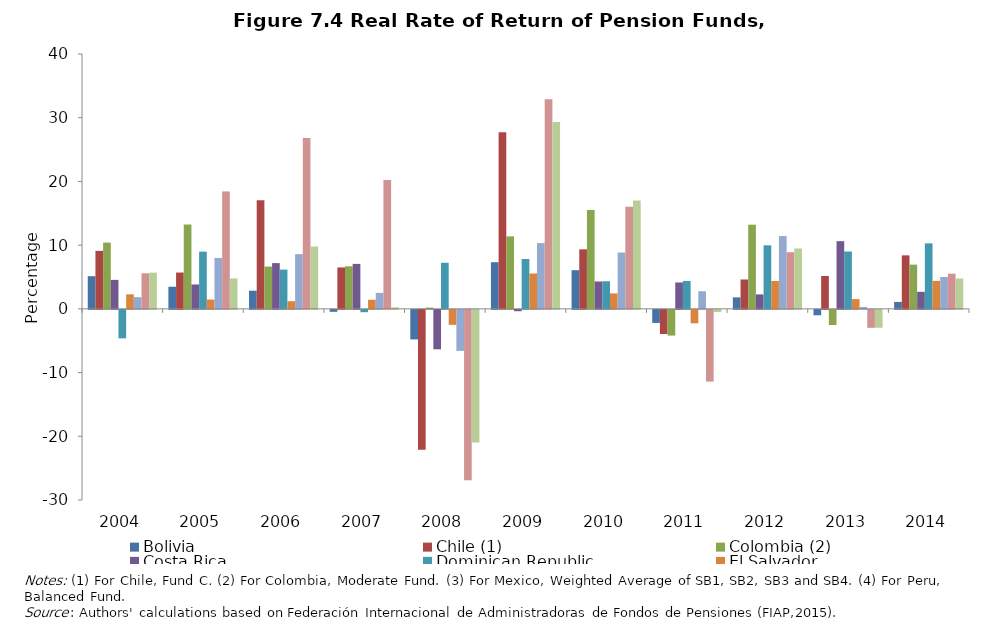
| Category | Bolivia | Chile (1) | Colombia (2) | Costa Rica | Dominican Republic | El Salvador | Mexico (3) | Peru (4) | Uruguay |
|---|---|---|---|---|---|---|---|---|---|
| 2004.0 | 5.13 | 9.1 | 10.4 | 4.547 | -4.47 | 2.28 | 1.83 | 5.58 | 5.68 |
| 2005.0 | 3.47 | 5.7 | 13.23 | 3.829 | 8.98 | 1.46 | 7.99 | 18.43 | 4.77 |
| 2006.0 | 2.85 | 17.04 | 6.63 | 7.179 | 6.16 | 1.2 | 8.59 | 26.82 | 9.78 |
| 2007.0 | -0.308 | 6.5 | 6.68 | 7.058 | -0.37 | 1.43 | 2.51 | 20.24 | 0.24 |
| 2008.0 | -4.64 | -21.97 | 0.2 | -6.189 | 7.23 | -2.356 | -6.44 | -26.74 | -20.814 |
| 2009.0 | 7.32 | 27.73 | 11.373 | -0.212 | 7.83 | 5.55 | 10.321 | 32.88 | 29.332 |
| 2010.0 | 6.07 | 9.34 | 15.524 | 4.296 | 4.332 | 2.422 | 8.843 | 16.03 | 17.004 |
| 2011.0 | -2.05 | -3.79 | -4.033 | 4.142 | 4.382 | -2.118 | 2.762 | -11.26 | -0.344 |
| 2012.0 | 1.8 | 4.61 | 13.206 | 2.269 | 9.971 | 4.37 | 11.425 | 8.894 | 9.47 |
| 2013.0 | -0.85 | 5.16 | -2.378 | 10.624 | 9 | 1.53 | 0.3 | -2.818 | -2.802 |
| 2014.0 | 1.09 | 8.4 | 6.939 | 2.672 | 10.28 | 4.39 | 5 | 5.517 | 4.753 |